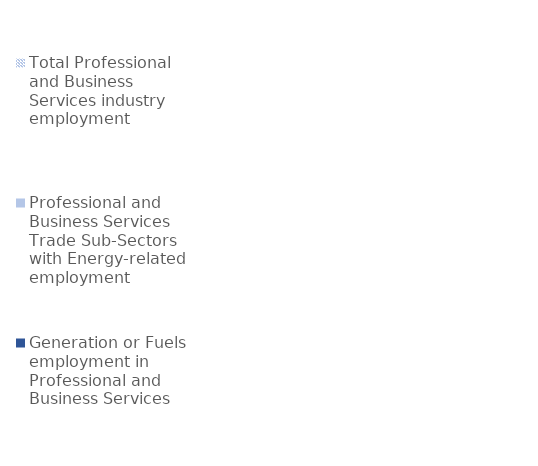
| Category | Total Professional and Business Services industry employment | Professional and Business Services Trade Sub-Sectors with Energy-related employment | Generation or Fuels employment in Professional and Business Services |
|---|---|---|---|
| Generation | 27769094 | 8450441 | 145820.764 |
| Fuels | 27769094 | 8450441 | 157962.618 |